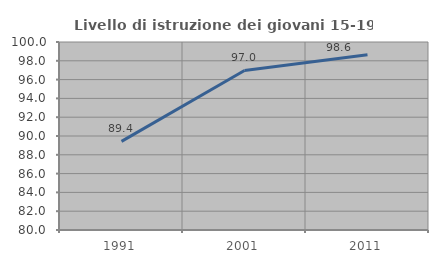
| Category | Livello di istruzione dei giovani 15-19 anni |
|---|---|
| 1991.0 | 89.433 |
| 2001.0 | 96.975 |
| 2011.0 | 98.636 |